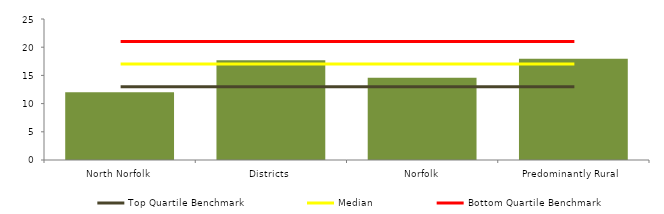
| Category | Block Data |
|---|---|
| North Norfolk | 12 |
| Districts | 17.674 |
| Norfolk | 14.571 |
|  Predominantly Rural   | 17.944 |